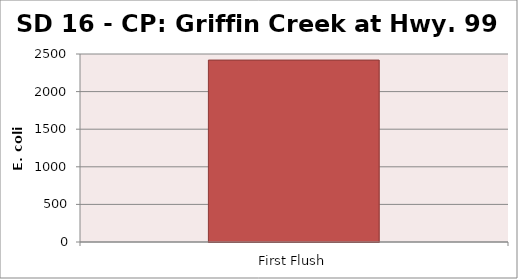
| Category | E. coli MPN |
|---|---|
| First Flush | 2419.2 |